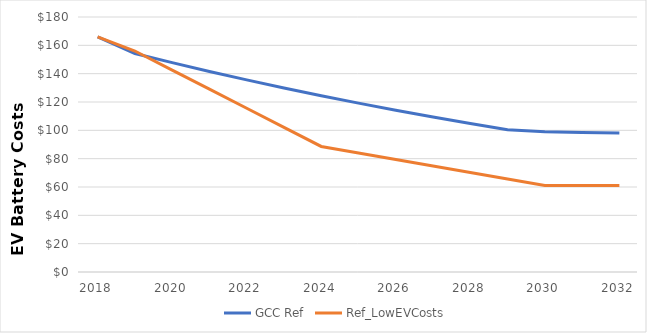
| Category | GCC Ref | Ref_LowEVCosts |
|---|---|---|
| 2018.0 | 166 | 166 |
| 2019.0 | 154.25 | 156 |
| 2020.0 | 147.769 | 142.526 |
| 2021.0 | 141.555 | 129.052 |
| 2022.0 | 135.603 | 115.577 |
| 2023.0 | 129.901 | 102.103 |
| 2024.0 | 124.438 | 88.629 |
| 2025.0 | 119.206 | 84.024 |
| 2026.0 | 114.193 | 79.419 |
| 2027.0 | 109.391 | 74.815 |
| 2028.0 | 104.791 | 70.21 |
| 2029.0 | 100.385 | 65.605 |
| 2030.0 | 99 | 61 |
| 2031.0 | 98.55 | 61 |
| 2032.0 | 98.1 | 61 |